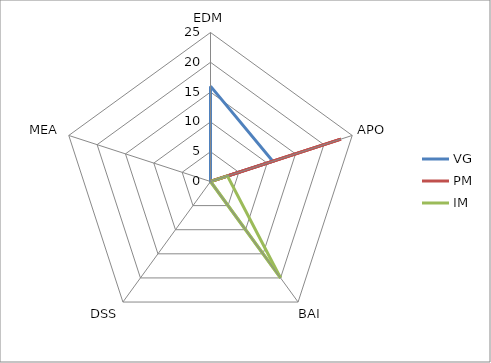
| Category | VG | PM | IM |
|---|---|---|---|
| 0 | 16 | 0 | 0 |
| 1 | 11 | 23 | 3 |
| 2 | 0 | 0 | 20 |
| 3 | 0 | 0 | 0 |
| 4 | 0 | 0 | 0 |